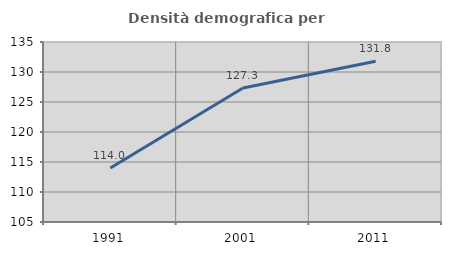
| Category | Densità demografica |
|---|---|
| 1991.0 | 114.004 |
| 2001.0 | 127.32 |
| 2011.0 | 131.804 |